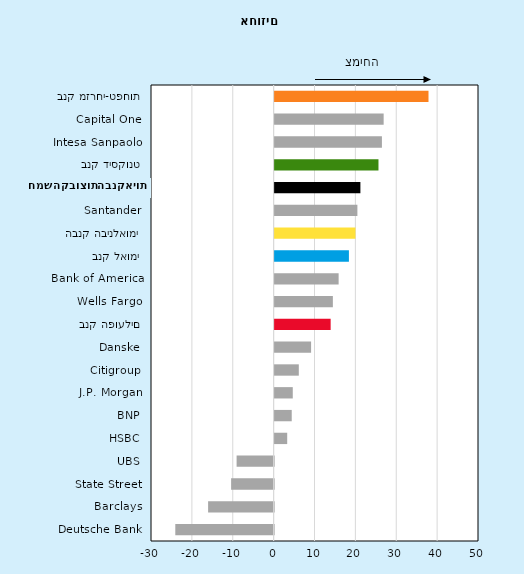
| Category | שינוי בנכסים משנת 2014 |
|---|---|
| Deutsche Bank | -24.055 |
| Barclays | -16.03 |
| State Street | -10.4 |
| UBS | -9.057 |
| HSBC | 3.076 |
| BNP | 4.185 |
| J.P. Morgan | 4.44 |
| Citigroup | 5.916 |
| Danske | 8.921 |
| בנק הפועלים | 13.706 |
| Wells Fargo | 14.249 |
| Bank of America | 15.659 |
| בנק לאומי | 18.175 |
| הבנק הבינלאומי | 19.781 |
| Santander | 20.248 |
| חמש הקבוצות הבנקאיות | 20.983 |
| בנק דיסקונט | 25.406 |
| Intesa Sanpaolo | 26.248 |
| Capital One | 26.673 |
| בנק מזרחי-טפחות | 37.645 |